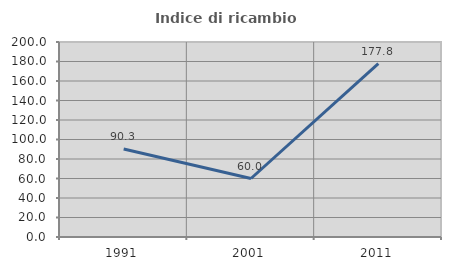
| Category | Indice di ricambio occupazionale  |
|---|---|
| 1991.0 | 90.323 |
| 2001.0 | 60 |
| 2011.0 | 177.778 |